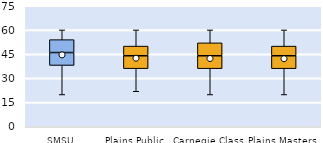
| Category | 25th | 50th | 75th |
|---|---|---|---|
| SMSU | 38 | 8 | 8 |
| Plains Public | 36 | 8 | 6 |
| Carnegie Class | 36 | 8 | 8 |
| Plains Masters | 36 | 8 | 6 |